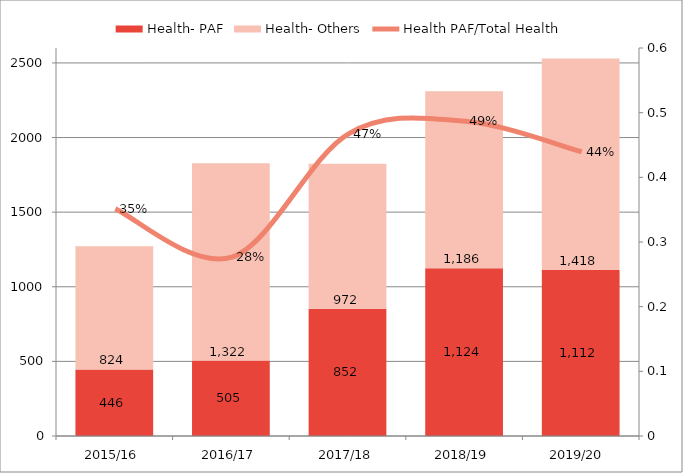
| Category | Health- PAF | Health- Others |
|---|---|---|
| 2015/16 | 446.4 | 824.4 |
| 2016/17 | 505.24 | 1322.02 |
| 2017/18 | 852.44 | 971.64 |
| 2018/19 | 1124.33 | 1185.738 |
| 2019/20  | 1111.81 | 1417.78 |